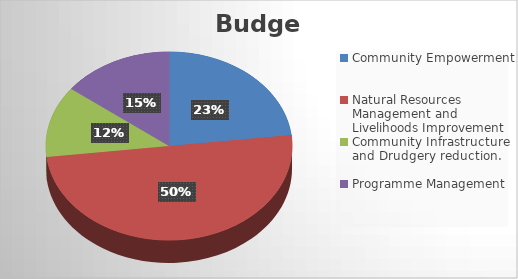
| Category | Budget |
|---|---|
| Community Empowerment | 265478135 |
| Natural Resources Management and Livelihoods Improvement | 574077200 |
| Community Infrastructure and Drudgery reduction. | 140785000 |
| Programme Management | 167624000 |